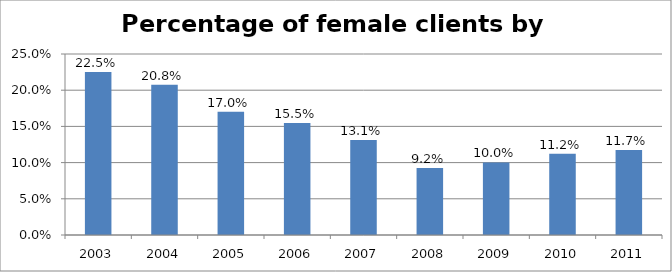
| Category | Female % |
|---|---|
| 2003.0 | 0.225 |
| 2004.0 | 0.208 |
| 2005.0 | 0.17 |
| 2006.0 | 0.155 |
| 2007.0 | 0.131 |
| 2008.0 | 0.092 |
| 2009.0 | 0.1 |
| 2010.0 | 0.112 |
| 2011.0 | 0.117 |